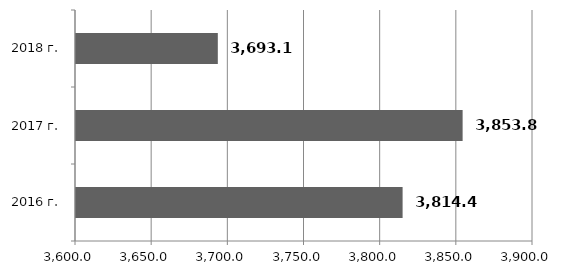
| Category | Series 0 |
|---|---|
| 2016 г. | 3814.4 |
| 2017 г. | 3853.8 |
| 2018 г. | 3693.1 |